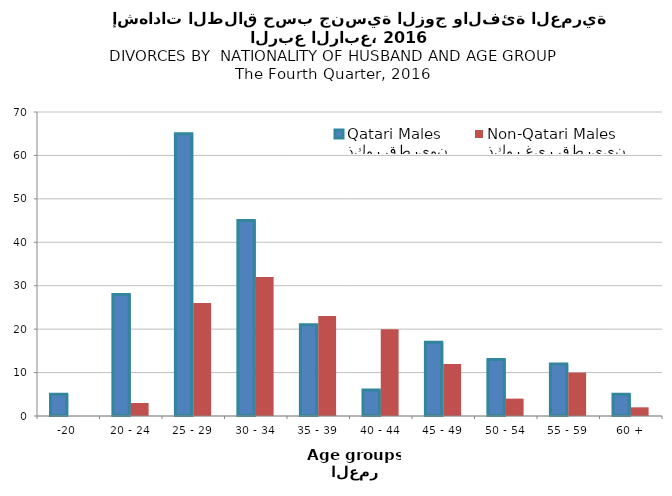
| Category | ذكور قطريون
Qatari Males | ذكور غير قطريين
Non-Qatari Males |
|---|---|---|
| -20 | 5 | 0 |
| 20 - 24 | 28 | 3 |
| 25 - 29 | 65 | 26 |
| 30 - 34 | 45 | 32 |
| 35 - 39 | 21 | 23 |
| 40 - 44 | 6 | 20 |
| 45 - 49 | 17 | 12 |
| 50 - 54 | 13 | 4 |
| 55 - 59 | 12 | 10 |
| 60 + | 5 | 2 |